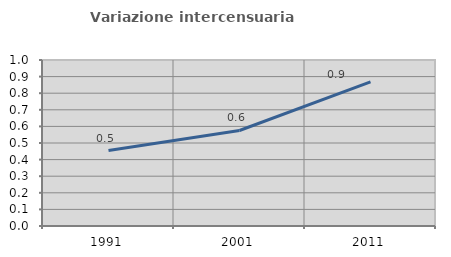
| Category | Variazione intercensuaria annua |
|---|---|
| 1991.0 | 0.455 |
| 2001.0 | 0.575 |
| 2011.0 | 0.868 |